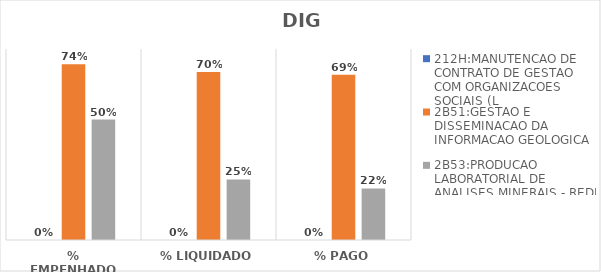
| Category | 212H:MANUTENCAO DE CONTRATO DE GESTAO COM ORGANIZACOES SOCIAIS (L | 2B51:GESTAO E DISSEMINACAO DA INFORMACAO GEOLOGICA | 2B53:PRODUCAO LABORATORIAL DE ANALISES MINERAIS - REDE LAMIN |
|---|---|---|---|
| % EMPENHADO | 0 | 0.736 | 0.504 |
| % LIQUIDADO | 0 | 0.704 | 0.254 |
| % PAGO | 0 | 0.693 | 0.216 |